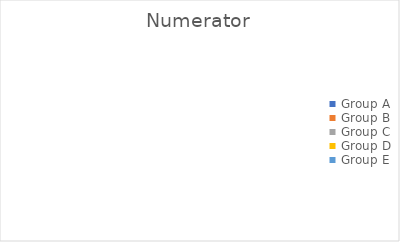
| Category | Numerator |
|---|---|
| Group A | 0 |
| Group B | 0 |
| Group C | 0 |
| Group D | 0 |
| Group E | 0 |